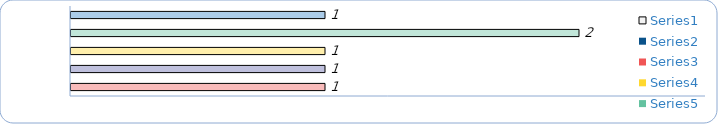
| Category | Series 0 | Series 1 | Series 2 | Series 3 | Series 4 |
|---|---|---|---|---|---|
| Status #1 | 1 |  |  |  |  |
| Status #2 | 2 |  |  |  |  |
| Status #3 | 1 |  |  |  |  |
| Status #4 | 1 |  |  |  |  |
| Status #5 | 1 |  |  |  |  |